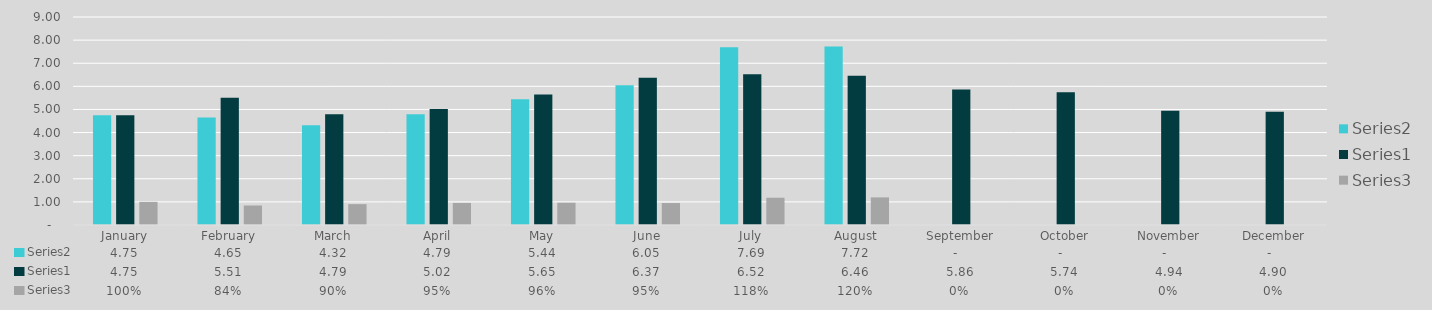
| Category | Series 1 | Series 0 | Series 2 |
|---|---|---|---|
| January | 4.75 | 4.75 | 1 |
| February | 4.65 | 5.51 | 0.844 |
| March | 4.32 | 4.79 | 0.902 |
| April | 4.79 | 5.02 | 0.954 |
| May | 5.44 | 5.65 | 0.963 |
| June | 6.05 | 6.37 | 0.95 |
| July | 7.69 | 6.52 | 1.179 |
| August | 7.72 | 6.46 | 1.195 |
| September | 0 | 5.86 | 0 |
| October | 0 | 5.74 | 0 |
| November | 0 | 4.94 | 0 |
| December | 0 | 4.9 | 0 |